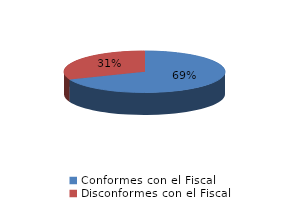
| Category | Series 0 |
|---|---|
| 0 | 2484 |
| 1 | 1118 |